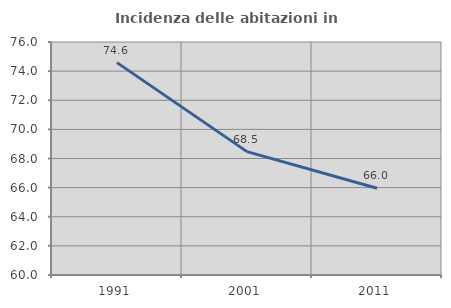
| Category | Incidenza delle abitazioni in proprietà  |
|---|---|
| 1991.0 | 74.584 |
| 2001.0 | 68.472 |
| 2011.0 | 65.957 |